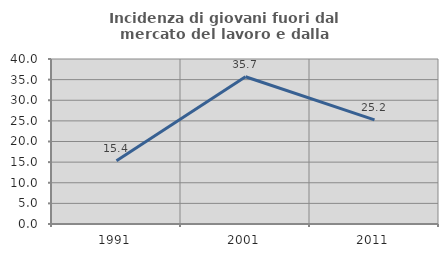
| Category | Incidenza di giovani fuori dal mercato del lavoro e dalla formazione  |
|---|---|
| 1991.0 | 15.35 |
| 2001.0 | 35.703 |
| 2011.0 | 25.226 |